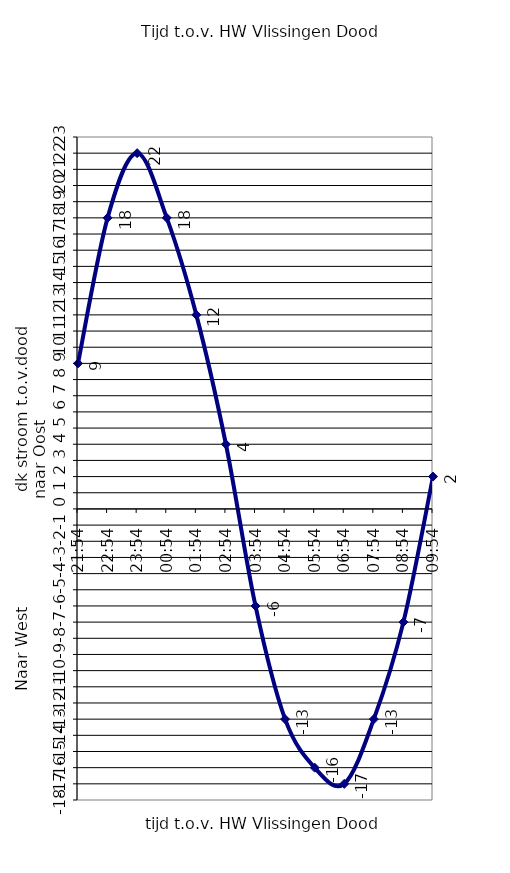
| Category | Series 0 |
|---|---|
| 21:54 | 9 |
| 22:54 | 18 |
| 23:54 | 22 |
| 00:54 | 18 |
| 01:54 | 12 |
| 02:54 | 4 |
| 0.1625 | -6 |
| 04:54 | -13 |
| 05:54 | -16 |
| 06:54 | -17 |
| 07:54 | -13 |
| 08:54 | -7 |
| 09:54 | 2 |